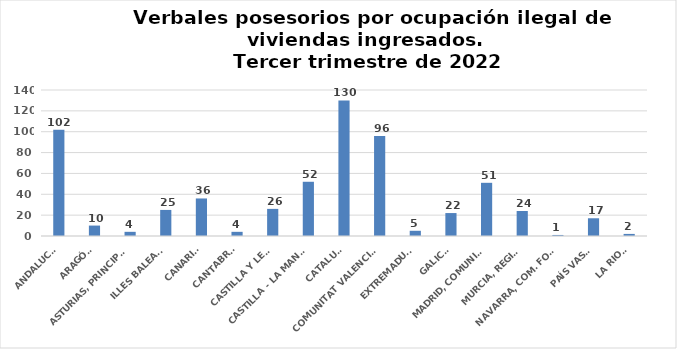
| Category | Series 0 |
|---|---|
| ANDALUCÍA | 102 |
| ARAGÓN | 10 |
| ASTURIAS, PRINCIPADO | 4 |
| ILLES BALEARS | 25 |
| CANARIAS | 36 |
| CANTABRIA | 4 |
| CASTILLA Y LEÓN | 26 |
| CASTILLA - LA MANCHA | 52 |
| CATALUÑA | 130 |
| COMUNITAT VALENCIANA | 96 |
| EXTREMADURA | 5 |
| GALICIA | 22 |
| MADRID, COMUNIDAD | 51 |
| MURCIA, REGIÓN | 24 |
| NAVARRA, COM. FORAL | 1 |
| PAÍS VASCO | 17 |
| LA RIOJA | 2 |